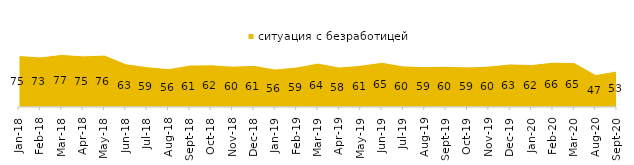
| Category | ситуация с безработицей |
|---|---|
| 2018-01-01 | 75.4 |
| 2018-02-01 | 73.25 |
| 2018-03-01 | 76.95 |
| 2018-04-01 | 74.85 |
| 2018-05-01 | 76 |
| 2018-06-01 | 63.4 |
| 2018-07-01 | 59 |
| 2018-08-01 | 56 |
| 2018-09-01 | 61.35 |
| 2018-10-01 | 61.75 |
| 2018-11-01 | 59.78 |
| 2018-12-01 | 60.95 |
| 2019-01-01 | 55.55 |
| 2019-02-01 | 58.5 |
| 2019-03-01 | 64.296 |
| 2019-04-01 | 58.416 |
| 2019-05-01 | 61.169 |
| 2019-06-01 | 65.436 |
| 2019-07-01 | 60.099 |
| 2019-08-01 | 59.241 |
| 2019-09-01 | 59.703 |
| 2019-10-01 | 58.614 |
| 2019-11-01 | 59.851 |
| 2019-12-01 | 63.02 |
| 2020-01-01 | 62.129 |
| 2020-02-01 | 65.594 |
| 2020-03-01 | 64.998 |
| 2020-08-01 | 47.418 |
| 2020-09-01 | 52.763 |